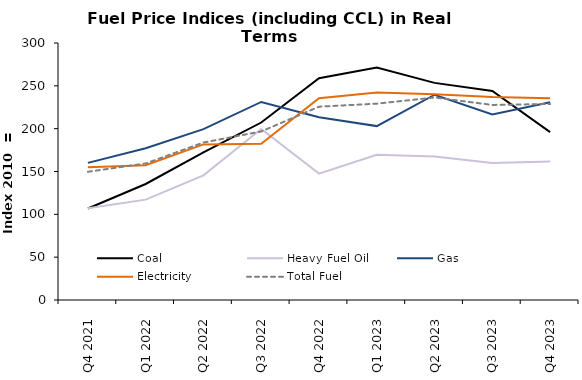
| Category | Coal | Heavy Fuel Oil | Gas | Electricity | Total Fuel |
|---|---|---|---|---|---|
| Q4 2021 | 106.807 | 107.193 | 160.053 | 154.939 | 149.656 |
| Q1 2022 | 135.415 | 117.168 | 177.142 | 157.331 | 159.367 |
| Q2 2022 | 172.345 | 145.467 | 199.403 | 181.628 | 183.823 |
| Q3 2022 | 207.176 | 199.709 | 231.173 | 182.344 | 196.734 |
| Q4 2022 | 258.813 | 147.498 | 213.272 | 235.408 | 225.651 |
| Q1 2023 | 271.481 | 169.41 | 202.996 | 242.305 | 229.195 |
| Q2 2023 | 253.451 | 167.422 | 239.604 | 240.101 | 236.382 |
| Q3 2023 | 244.011 | 159.973 | 216.55 | 237.018 | 227.705 |
| Q4 2023 | 196.007 | 161.729 | 230.929 | 235.565 | 228.809 |